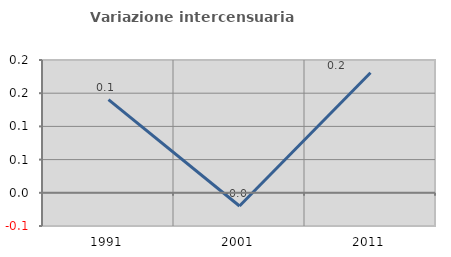
| Category | Variazione intercensuaria annua |
|---|---|
| 1991.0 | 0.14 |
| 2001.0 | -0.02 |
| 2011.0 | 0.181 |